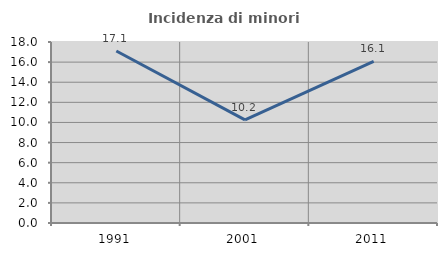
| Category | Incidenza di minori stranieri |
|---|---|
| 1991.0 | 17.105 |
| 2001.0 | 10.249 |
| 2011.0 | 16.075 |